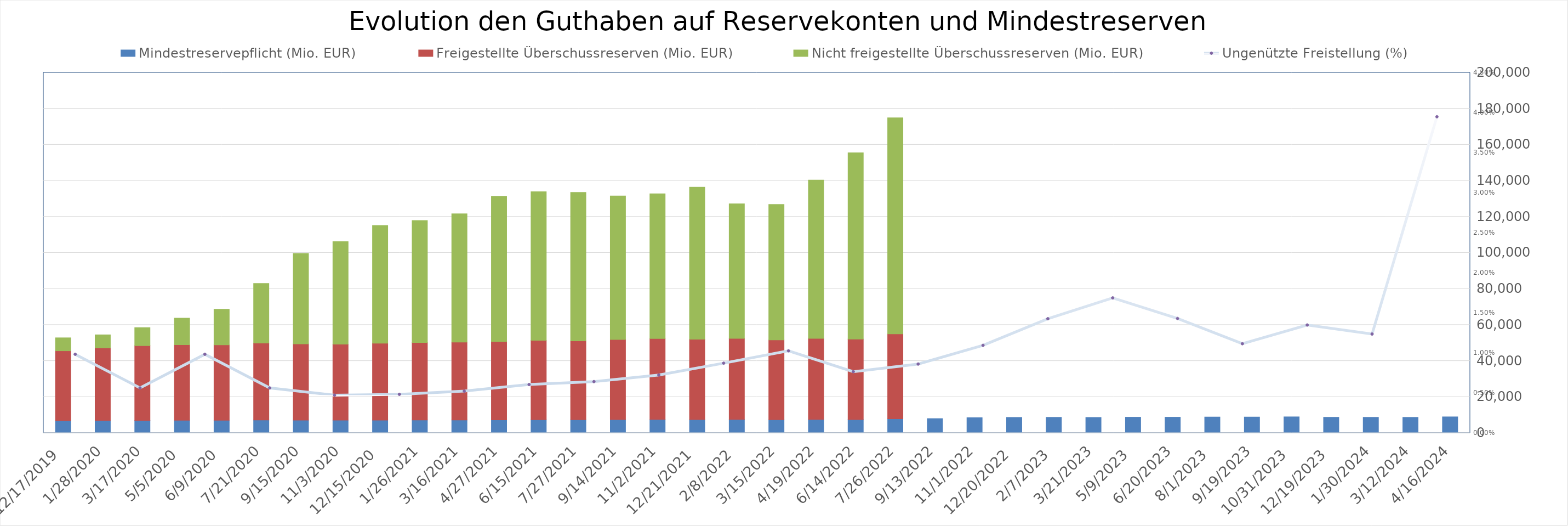
| Category | Mindestreservepflicht (Mio. EUR) | Freigestellte Überschussreserven (Mio. EUR) | Nicht freigestellte Überschussreserven (Mio. EUR) |
|---|---|---|---|
| 4/16/24 | 8997 | 0 | 0 |
| 3/12/24 | 8722 | 0 | 0 |
| 1/30/24 | 8741.019 | 0 | 0 |
| 12/19/23 | 8762 | 0 | 0 |
| 10/31/23 | 9001 | 0 | 0 |
| 9/19/23 | 8896 | 0 | 0 |
| 8/1/23 | 8904 | 0 | 0 |
| 6/20/23 | 8799 | 0 | 0 |
| 5/9/23 | 8796 | 0 | 0 |
| 3/21/23 | 8668 | 0 | 0 |
| 2/7/23 | 8736 | 0 | 0 |
| 12/20/22 | 8689 | 0 | 0 |
| 11/1/22 | 8517 | 0 | 0 |
| 9/13/22 | 8018 | 0 | 0 |
| 7/26/22 | 7929 | 47109 | 119909 |
| 6/14/22 | 7495 | 44621 | 103454 |
| 4/19/22 | 7536 | 44962 | 87885 |
| 3/15/22 | 7409 | 44244 | 75192 |
| 2/8/22 | 7536 | 44997 | 74696 |
| 12/21/21 | 7472 | 44599 | 84381 |
| 11/2/21 | 7531 | 44914 | 80355 |
| 9/14/21 | 7460 | 44471 | 79647 |
| 7/27/21 | 7352 | 43793 | 82435 |
| 6/15/21 | 7404 | 44036 | 82520 |
| 4/27/21 | 7313 | 43430 | 80697 |
| 3/16/21 | 7254 | 43192 | 71224 |
| 1/26/21 | 7225 | 42978 | 67723 |
| 12/15/20 | 7190 | 42671 | 65344 |
| 11/3/20 | 7128 | 42161 | 56951 |
| 9/15/20 | 7165 | 42265 | 50289 |
| 7/21/20 | 7217 | 42685 | 33099 |
| 6/9/20 | 7060 | 41891 | 19741 |
| 5/5/20 | 7085 | 41937 | 14783 |
| 3/17/20 | 7002 | 41491 | 10061 |
| 1/28/20 | 6981 | 40234 | 7303 |
| 12/17/19 | 6887 | 38752 | 7220 |